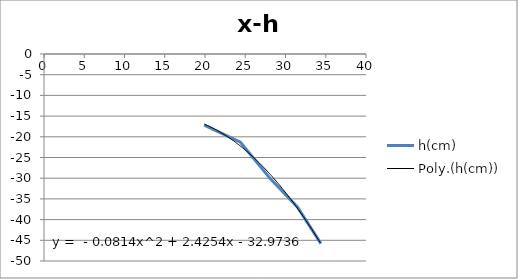
| Category | h(cm) |
|---|---|
| 19.9 | -17.2 |
| 24.4 | -21.3 |
| 28.1 | -30.1 |
| 31.5 | -37 |
| 34.4 | -45.8 |